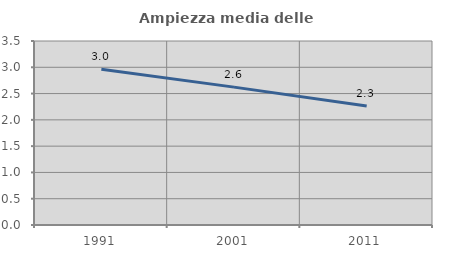
| Category | Ampiezza media delle famiglie |
|---|---|
| 1991.0 | 2.961 |
| 2001.0 | 2.623 |
| 2011.0 | 2.265 |